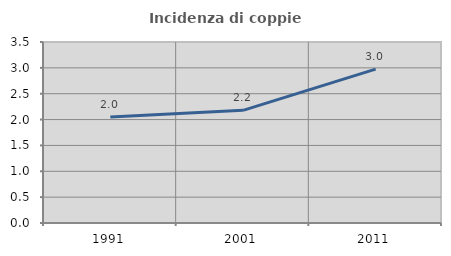
| Category | Incidenza di coppie miste |
|---|---|
| 1991.0 | 2.049 |
| 2001.0 | 2.178 |
| 2011.0 | 2.975 |